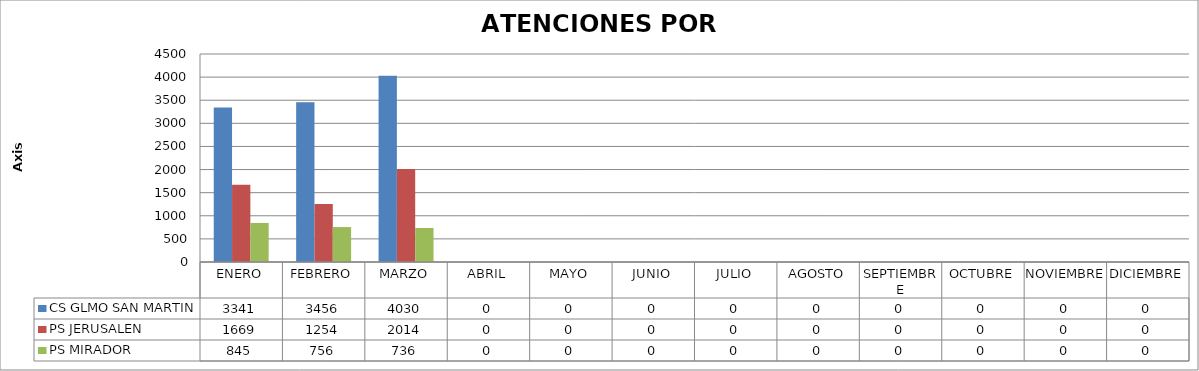
| Category | CS GLMO SAN MARTIN | PS JERUSALEN | PS MIRADOR |
|---|---|---|---|
| ENERO | 3341 | 1669 | 845 |
| FEBRERO | 3456 | 1254 | 756 |
| MARZO | 4030 | 2014 | 736 |
| ABRIL | 0 | 0 | 0 |
| MAYO | 0 | 0 | 0 |
| JUNIO | 0 | 0 | 0 |
| JULIO | 0 | 0 | 0 |
| AGOSTO | 0 | 0 | 0 |
| SEPTIEMBRE | 0 | 0 | 0 |
| OCTUBRE | 0 | 0 | 0 |
| NOVIEMBRE | 0 | 0 | 0 |
| DICIEMBRE | 0 | 0 | 0 |